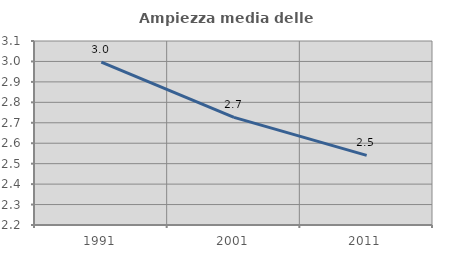
| Category | Ampiezza media delle famiglie |
|---|---|
| 1991.0 | 2.996 |
| 2001.0 | 2.727 |
| 2011.0 | 2.54 |